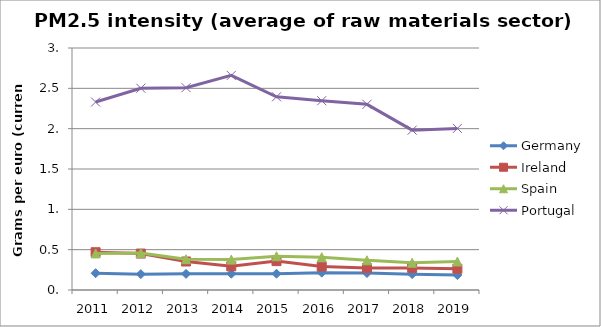
| Category | Germany | Ireland | Spain | Portugal |
|---|---|---|---|---|
| 2011 | 0.208 | 0.468 | 0.453 | 2.33 |
| 2012 | 0.197 | 0.452 | 0.458 | 2.502 |
| 2013 | 0.2 | 0.353 | 0.382 | 2.508 |
| 2014 | 0.202 | 0.293 | 0.377 | 2.66 |
| 2015 | 0.202 | 0.358 | 0.418 | 2.395 |
| 2016 | 0.215 | 0.29 | 0.407 | 2.347 |
| 2017 | 0.21 | 0.272 | 0.368 | 2.302 |
| 2018 | 0.197 | 0.273 | 0.338 | 1.982 |
| 2019 | 0.185 | 0.263 | 0.353 | 2.003 |